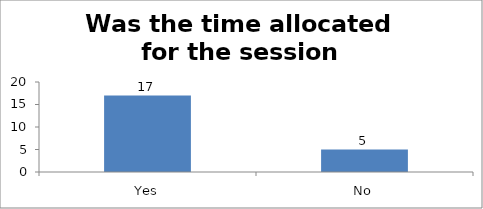
| Category | Was the time allocated for the session sufficient? |
|---|---|
| Yes | 17 |
| No | 5 |